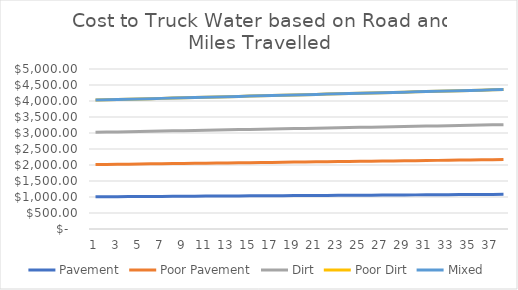
| Category | Pavement | Poor Pavement | Dirt | Poor Dirt | Mixed |
|---|---|---|---|---|---|
| 0 | 1007.047 | 1007.157 | 1007.269 | 1007.391 | 0 |
| 1 | 1009.094 | 1009.314 | 1009.538 | 1009.782 | 0 |
| 2 | 1011.141 | 1011.472 | 1011.806 | 1012.172 | 0 |
| 3 | 1013.187 | 1013.629 | 1014.075 | 1014.563 | 0 |
| 4 | 1015.234 | 1015.786 | 1016.344 | 1016.954 | 0 |
| 5 | 1017.281 | 1017.943 | 1018.613 | 1019.345 | 0 |
| 6 | 1019.328 | 1020.101 | 1020.882 | 1021.736 | 0 |
| 7 | 1021.375 | 1022.258 | 1023.15 | 1024.127 | 0 |
| 8 | 1023.422 | 1024.415 | 1025.419 | 1026.517 | 0 |
| 9 | 1025.469 | 1026.572 | 1027.688 | 1028.908 | 0 |
| 10 | 1027.515 | 1028.73 | 1029.957 | 1031.299 | 0 |
| 11 | 1029.562 | 1030.887 | 1032.226 | 1033.69 | 0 |
| 12 | 1031.609 | 1033.044 | 1034.494 | 1036.081 | 0 |
| 13 | 1033.656 | 1035.201 | 1036.763 | 1038.472 | 0 |
| 14 | 1035.703 | 1037.358 | 1039.032 | 1040.862 | 0 |
| 15 | 1037.75 | 1039.516 | 1041.301 | 1043.253 | 0 |
| 16 | 1039.797 | 1041.673 | 1043.57 | 1045.644 | 0 |
| 17 | 1041.843 | 1043.83 | 1045.838 | 1048.035 | 0 |
| 18 | 1043.89 | 1045.987 | 1048.107 | 1050.426 | 0 |
| 19 | 1045.937 | 1048.145 | 1050.376 | 1052.817 | 0 |
| 20 | 1047.984 | 1050.302 | 1052.645 | 1055.207 | 0 |
| 21 | 1050.031 | 1052.459 | 1054.914 | 1057.598 | 0 |
| 22 | 1052.078 | 1054.616 | 1057.182 | 1059.989 | 0 |
| 23 | 1054.125 | 1056.773 | 1059.451 | 1062.38 | 0 |
| 24 | 1056.171 | 1058.931 | 1061.72 | 1064.771 | 0 |
| 25 | 1058.218 | 1061.088 | 1063.989 | 1067.162 | 0 |
| 26 | 1060.265 | 1063.245 | 1066.258 | 1069.552 | 0 |
| 27 | 1062.312 | 1065.402 | 1068.526 | 1071.943 | 0 |
| 28 | 1064.359 | 1067.56 | 1070.795 | 1074.334 | 0 |
| 29 | 1066.406 | 1069.717 | 1073.064 | 1076.725 | 0 |
| 30 | 1068.453 | 1071.874 | 1075.333 | 1079.116 | 0 |
| 31 | 1070.499 | 1074.031 | 1077.602 | 1081.507 | 0 |
| 32 | 1072.546 | 1076.189 | 1079.87 | 1083.897 | 0 |
| 33 | 1074.593 | 1078.346 | 1082.139 | 1086.288 | 0 |
| 34 | 1076.64 | 1080.503 | 1084.408 | 1088.679 | 0 |
| 35 | 1078.687 | 1082.66 | 1086.677 | 1091.07 | 0 |
| 36 | 1080.734 | 1084.817 | 1088.946 | 1093.461 | 0 |
| 37 | 1082.781 | 1086.975 | 1091.214 | 1095.851 | 0 |